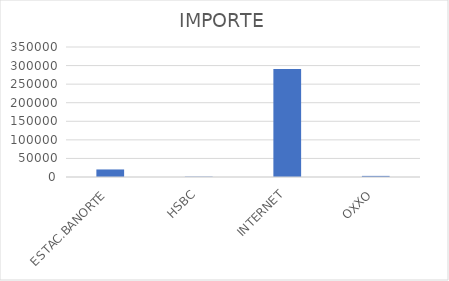
| Category | IMPORTE |
|---|---|
| ESTAC.BANORTE | 20300.1 |
| HSBC | 991.12 |
| INTERNET | 290808.12 |
| OXXO | 2990.71 |